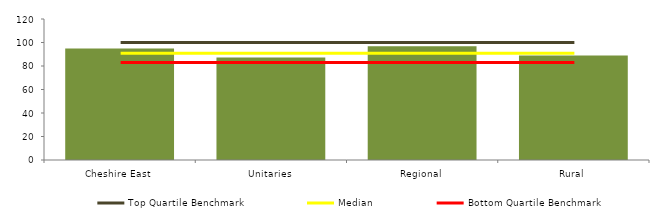
| Category | Block Data |
|---|---|
| Cheshire East | 95 |
| Unitaries | 87.278 |
| Regional | 96.786 |
|  Rural  | 88.841 |